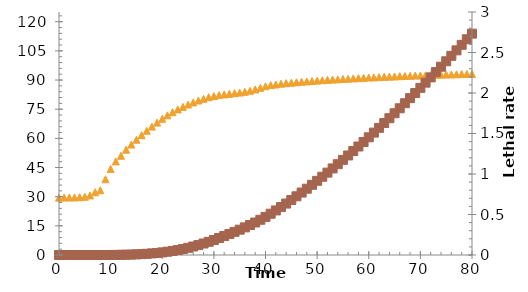
| Category | Series 0 |
|---|---|
| 0.0 | 29.5 |
| 1.0 | 29.55 |
| 2.0 | 29.6 |
| 3.0 | 29.6 |
| 4.0 | 29.75 |
| 5.0 | 29.95 |
| 6.0 | 30.65 |
| 7.0 | 32.3 |
| 8.0 | 33.3 |
| 9.0 | 38.95 |
| 10.0 | 44.3 |
| 11.0 | 48.15 |
| 12.0 | 51.05 |
| 13.0 | 54.15 |
| 14.0 | 56.8 |
| 15.0 | 59.3 |
| 16.0 | 61.65 |
| 17.0 | 63.9 |
| 18.0 | 66.05 |
| 19.0 | 68.1 |
| 20.0 | 70.1 |
| 21.0 | 71.85 |
| 22.0 | 73.45 |
| 23.0 | 74.9 |
| 24.0 | 76.2 |
| 25.0 | 77.4 |
| 26.0 | 78.5 |
| 27.0 | 79.5 |
| 28.0 | 80.35 |
| 29.0 | 81.2 |
| 30.0 | 81.75 |
| 31.0 | 82.25 |
| 32.0 | 82.6 |
| 33.0 | 82.9 |
| 34.0 | 83.25 |
| 35.0 | 83.55 |
| 36.0 | 83.95 |
| 37.0 | 84.5 |
| 38.0 | 85.15 |
| 39.0 | 86 |
| 40.0 | 86.8 |
| 41.0 | 87.4 |
| 42.0 | 87.7 |
| 43.0 | 88.1 |
| 44.0 | 88.4 |
| 45.0 | 88.65 |
| 46.0 | 88.85 |
| 47.0 | 89.1 |
| 48.0 | 89.3 |
| 49.0 | 89.5 |
| 50.0 | 89.7 |
| 51.0 | 89.9 |
| 52.0 | 90.05 |
| 53.0 | 90.25 |
| 54.0 | 90.35 |
| 55.0 | 90.55 |
| 56.0 | 90.65 |
| 57.0 | 90.85 |
| 58.0 | 90.95 |
| 59.0 | 91.1 |
| 60.0 | 91.3 |
| 61.0 | 91.35 |
| 62.0 | 91.5 |
| 63.0 | 91.65 |
| 64.0 | 91.75 |
| 65.0 | 91.85 |
| 66.0 | 92 |
| 67.0 | 92.1 |
| 68.0 | 92.15 |
| 69.0 | 92.3 |
| 70.0 | 92.35 |
| 71.0 | 92.45 |
| 72.0 | 92.6 |
| 73.0 | 92.65 |
| 74.0 | 92.75 |
| 75.0 | 92.85 |
| 76.0 | 92.9 |
| 77.0 | 92.95 |
| 78.0 | 93.1 |
| 79.0 | 93.1 |
| 80.0 | 93.15 |
| 81.0 | 93.25 |